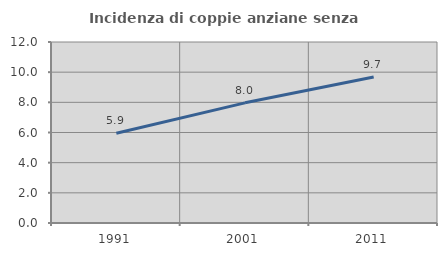
| Category | Incidenza di coppie anziane senza figli  |
|---|---|
| 1991.0 | 5.949 |
| 2001.0 | 7.966 |
| 2011.0 | 9.682 |